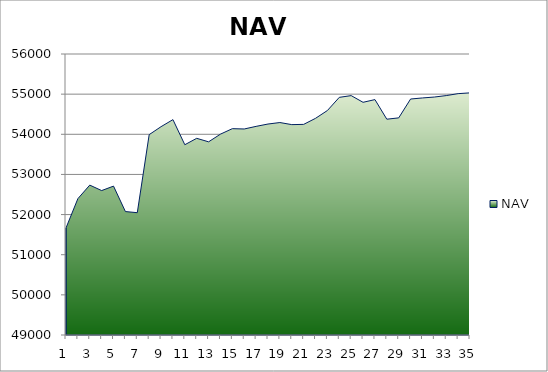
| Category | NAV |
|---|---|
| 0 | 51667 |
| 1 | 52397 |
| 2 | 52733.957 |
| 3 | 52597.875 |
| 4 | 52708.772 |
| 5 | 52075.184 |
| 6 | 52046.775 |
| 7 | 53991.219 |
| 8 | 54189.909 |
| 9 | 54364.909 |
| 10 | 53739.909 |
| 11 | 53899.542 |
| 12 | 53812.294 |
| 13 | 54003.961 |
| 14 | 54140.037 |
| 15 | 54132.37 |
| 16 | 54197.37 |
| 17 | 54255.812 |
| 18 | 54292.622 |
| 19 | 54240.699 |
| 20 | 54246.834 |
| 21 | 54397.391 |
| 22 | 54592.197 |
| 23 | 54920.119 |
| 24 | 54963.245 |
| 25 | 54796.799 |
| 26 | 54863.963 |
| 27 | 54375.975 |
| 28 | 54409.015 |
| 29 | 54878.402 |
| 30 | 54905.151 |
| 31 | 54927.958 |
| 32 | 54964.157 |
| 33 | 55012.385 |
| 34 | 55031.616 |